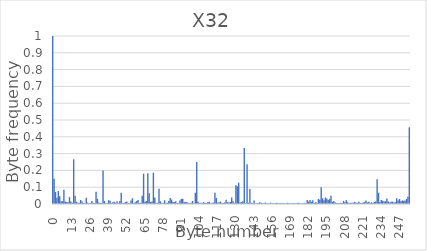
| Category | Series 0 |
|---|---|
| 0.0 | 1 |
| 1.0 | 0.151 |
| 2.0 | 0.072 |
| 3.0 | 0.037 |
| 4.0 | 0.078 |
| 5.0 | 0.046 |
| 6.0 | 0.017 |
| 7.0 | 0.017 |
| 8.0 | 0.085 |
| 9.0 | 0.015 |
| 10.0 | 0.012 |
| 11.0 | 0.01 |
| 12.0 | 0.041 |
| 13.0 | 0.015 |
| 14.0 | 0.008 |
| 15.0 | 0.266 |
| 16.0 | 0.05 |
| 17.0 | 0.014 |
| 18.0 | 0.008 |
| 19.0 | 0.007 |
| 20.0 | 0.024 |
| 21.0 | 0.016 |
| 22.0 | 0.007 |
| 23.0 | 0.006 |
| 24.0 | 0.038 |
| 25.0 | 0.008 |
| 26.0 | 0.005 |
| 27.0 | 0.006 |
| 28.0 | 0.018 |
| 29.0 | 0.008 |
| 30.0 | 0.005 |
| 31.0 | 0.073 |
| 32.0 | 0.031 |
| 33.0 | 0.009 |
| 34.0 | 0.005 |
| 35.0 | 0.006 |
| 36.0 | 0.2 |
| 37.0 | 0.018 |
| 38.0 | 0.005 |
| 39.0 | 0.005 |
| 40.0 | 0.022 |
| 41.0 | 0.019 |
| 42.0 | 0.006 |
| 43.0 | 0.011 |
| 44.0 | 0.013 |
| 45.0 | 0.007 |
| 46.0 | 0.016 |
| 47.0 | 0.005 |
| 48.0 | 0.018 |
| 49.0 | 0.067 |
| 50.0 | 0.005 |
| 51.0 | 0.006 |
| 52.0 | 0.011 |
| 53.0 | 0.015 |
| 54.0 | 0.004 |
| 55.0 | 0.005 |
| 56.0 | 0.02 |
| 57.0 | 0.034 |
| 58.0 | 0.006 |
| 59.0 | 0.011 |
| 60.0 | 0.017 |
| 61.0 | 0.024 |
| 62.0 | 0.005 |
| 63.0 | 0.008 |
| 64.0 | 0.049 |
| 65.0 | 0.181 |
| 66.0 | 0.014 |
| 67.0 | 0.019 |
| 68.0 | 0.184 |
| 69.0 | 0.064 |
| 70.0 | 0.012 |
| 71.0 | 0.014 |
| 72.0 | 0.187 |
| 73.0 | 0.039 |
| 74.0 | 0.007 |
| 75.0 | 0.006 |
| 76.0 | 0.092 |
| 77.0 | 0.016 |
| 78.0 | 0.006 |
| 79.0 | 0.006 |
| 80.0 | 0.023 |
| 81.0 | 0.006 |
| 82.0 | 0.008 |
| 83.0 | 0.018 |
| 84.0 | 0.036 |
| 85.0 | 0.026 |
| 86.0 | 0.012 |
| 87.0 | 0.011 |
| 88.0 | 0.016 |
| 89.0 | 0.006 |
| 90.0 | 0.006 |
| 91.0 | 0.021 |
| 92.0 | 0.03 |
| 93.0 | 0.031 |
| 94.0 | 0.012 |
| 95.0 | 0.011 |
| 96.0 | 0.012 |
| 97.0 | 0.004 |
| 98.0 | 0.005 |
| 99.0 | 0.008 |
| 100.0 | 0.018 |
| 101.0 | 0.005 |
| 102.0 | 0.067 |
| 103.0 | 0.25 |
| 104.0 | 0.013 |
| 105.0 | 0.005 |
| 106.0 | 0.007 |
| 107.0 | 0.006 |
| 108.0 | 0.012 |
| 109.0 | 0.006 |
| 110.0 | 0.005 |
| 111.0 | 0.012 |
| 112.0 | 0.013 |
| 113.0 | 0.005 |
| 114.0 | 0.007 |
| 115.0 | 0.009 |
| 116.0 | 0.066 |
| 117.0 | 0.036 |
| 118.0 | 0.009 |
| 119.0 | 0.01 |
| 120.0 | 0.015 |
| 121.0 | 0.006 |
| 122.0 | 0.005 |
| 123.0 | 0.009 |
| 124.0 | 0.025 |
| 125.0 | 0.011 |
| 126.0 | 0.008 |
| 127.0 | 0.012 |
| 128.0 | 0.039 |
| 129.0 | 0.017 |
| 130.0 | 0.006 |
| 131.0 | 0.112 |
| 132.0 | 0.106 |
| 133.0 | 0.126 |
| 134.0 | 0.009 |
| 135.0 | 0.011 |
| 136.0 | 0.016 |
| 137.0 | 0.333 |
| 138.0 | 0.004 |
| 139.0 | 0.237 |
| 140.0 | 0.008 |
| 141.0 | 0.089 |
| 142.0 | 0.007 |
| 143.0 | 0.006 |
| 144.0 | 0.021 |
| 145.0 | 0.004 |
| 146.0 | 0.004 |
| 147.0 | 0.005 |
| 148.0 | 0.01 |
| 149.0 | 0.008 |
| 150.0 | 0.004 |
| 151.0 | 0.005 |
| 152.0 | 0.008 |
| 153.0 | 0.004 |
| 154.0 | 0.004 |
| 155.0 | 0.004 |
| 156.0 | 0.007 |
| 157.0 | 0.005 |
| 158.0 | 0.004 |
| 159.0 | 0.004 |
| 160.0 | 0.008 |
| 161.0 | 0.004 |
| 162.0 | 0.004 |
| 163.0 | 0.004 |
| 164.0 | 0.006 |
| 165.0 | 0.004 |
| 166.0 | 0.004 |
| 167.0 | 0.003 |
| 168.0 | 0.007 |
| 169.0 | 0.004 |
| 170.0 | 0.004 |
| 171.0 | 0.004 |
| 172.0 | 0.006 |
| 173.0 | 0.004 |
| 174.0 | 0.003 |
| 175.0 | 0.007 |
| 176.0 | 0.007 |
| 177.0 | 0.004 |
| 178.0 | 0.004 |
| 179.0 | 0.004 |
| 180.0 | 0.007 |
| 181.0 | 0.005 |
| 182.0 | 0.024 |
| 183.0 | 0.014 |
| 184.0 | 0.023 |
| 185.0 | 0.014 |
| 186.0 | 0.022 |
| 187.0 | 0.005 |
| 188.0 | 0.011 |
| 189.0 | 0.008 |
| 190.0 | 0.03 |
| 191.0 | 0.025 |
| 192.0 | 0.1 |
| 193.0 | 0.034 |
| 194.0 | 0.022 |
| 195.0 | 0.039 |
| 196.0 | 0.033 |
| 197.0 | 0.023 |
| 198.0 | 0.03 |
| 199.0 | 0.049 |
| 200.0 | 0.013 |
| 201.0 | 0.018 |
| 202.0 | 0.008 |
| 203.0 | 0.006 |
| 204.0 | 0.006 |
| 205.0 | 0.006 |
| 206.0 | 0.007 |
| 207.0 | 0.006 |
| 208.0 | 0.019 |
| 209.0 | 0.011 |
| 210.0 | 0.023 |
| 211.0 | 0.01 |
| 212.0 | 0.007 |
| 213.0 | 0.007 |
| 214.0 | 0.008 |
| 215.0 | 0.008 |
| 216.0 | 0.012 |
| 217.0 | 0.007 |
| 218.0 | 0.007 |
| 219.0 | 0.014 |
| 220.0 | 0.006 |
| 221.0 | 0.006 |
| 222.0 | 0.008 |
| 223.0 | 0.011 |
| 224.0 | 0.021 |
| 225.0 | 0.009 |
| 226.0 | 0.014 |
| 227.0 | 0.006 |
| 228.0 | 0.011 |
| 229.0 | 0.007 |
| 230.0 | 0.012 |
| 231.0 | 0.015 |
| 232.0 | 0.148 |
| 233.0 | 0.067 |
| 234.0 | 0.013 |
| 235.0 | 0.024 |
| 236.0 | 0.019 |
| 237.0 | 0.015 |
| 238.0 | 0.017 |
| 239.0 | 0.033 |
| 240.0 | 0.015 |
| 241.0 | 0.009 |
| 242.0 | 0.013 |
| 243.0 | 0.014 |
| 244.0 | 0.009 |
| 245.0 | 0.011 |
| 246.0 | 0.034 |
| 247.0 | 0.021 |
| 248.0 | 0.03 |
| 249.0 | 0.016 |
| 250.0 | 0.021 |
| 251.0 | 0.019 |
| 252.0 | 0.02 |
| 253.0 | 0.03 |
| 254.0 | 0.043 |
| 255.0 | 0.457 |